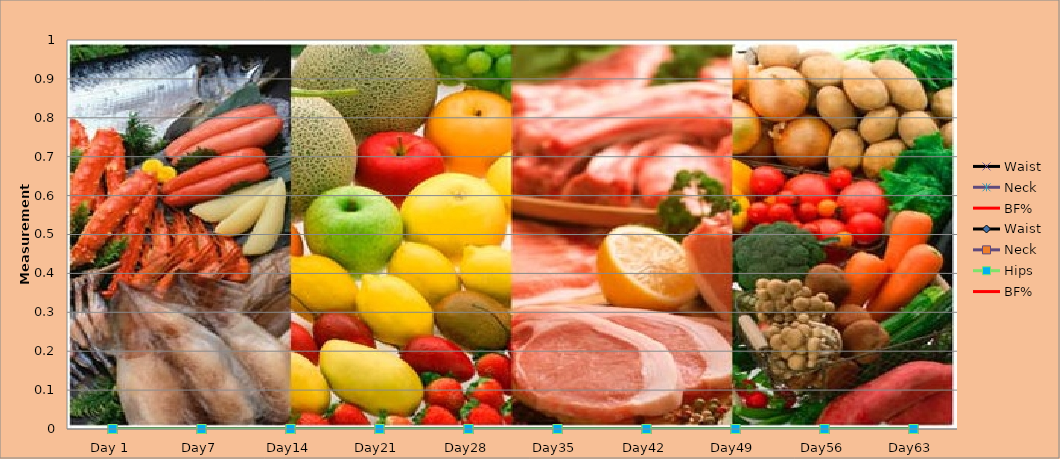
| Category | Waist | Neck | BF% | Hips |
|---|---|---|---|---|
| 0 | 0 | 0 | 0 | 0 |
| 1 | 0 | 0 | 0 | 0 |
| 2 | 0 | 0 | 0 | 0 |
| 3 | 0 | 0 | 0 | 0 |
| 4 | 0 | 0 | 0 | 0 |
| 5 | 0 | 0 | 0 | 0 |
| 6 | 0 | 0 | 0 | 0 |
| 7 | 0 | 0 | 0 | 0 |
| 8 | 0 | 0 | 0 | 0 |
| 9 | 0 | 0 | 0 | 0 |